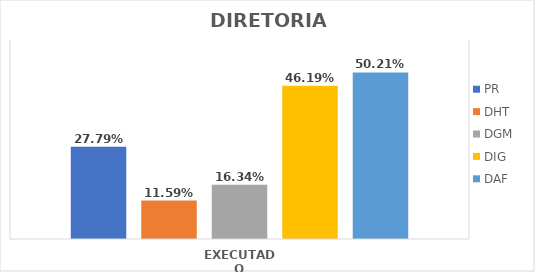
| Category | PR | DHT | DGM | DIG | DAF |
|---|---|---|---|---|---|
| EXECUTADO | 0.278 | 0.116 | 0.163 | 0.462 | 0.502 |